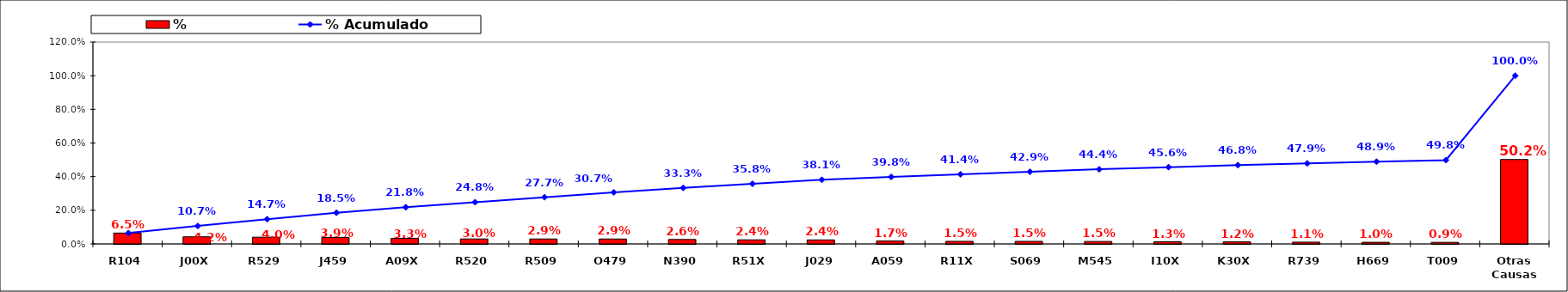
| Category | % |
|---|---|
| R104 | 0.065 |
| J00X | 0.042 |
| R529 | 0.04 |
| J459 | 0.039 |
| A09X | 0.033 |
| R520 | 0.03 |
| R509 | 0.029 |
| O479 | 0.029 |
| N390 | 0.026 |
| R51X | 0.024 |
| J029 | 0.024 |
| A059 | 0.017 |
| R11X | 0.015 |
| S069 | 0.015 |
| M545 | 0.015 |
| I10X | 0.013 |
| K30X | 0.012 |
| R739 | 0.011 |
| H669 | 0.01 |
| T009 | 0.009 |
| Otras Causas | 0.502 |